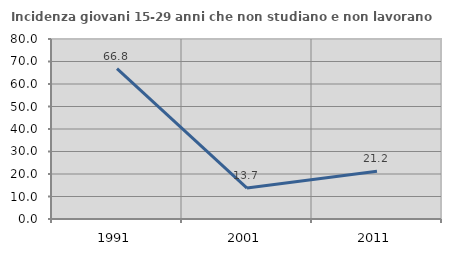
| Category | Incidenza giovani 15-29 anni che non studiano e non lavorano  |
|---|---|
| 1991.0 | 66.829 |
| 2001.0 | 13.744 |
| 2011.0 | 21.212 |